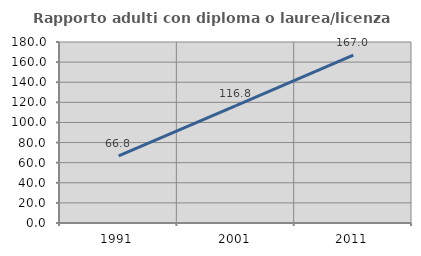
| Category | Rapporto adulti con diploma o laurea/licenza media  |
|---|---|
| 1991.0 | 66.807 |
| 2001.0 | 116.798 |
| 2011.0 | 166.983 |